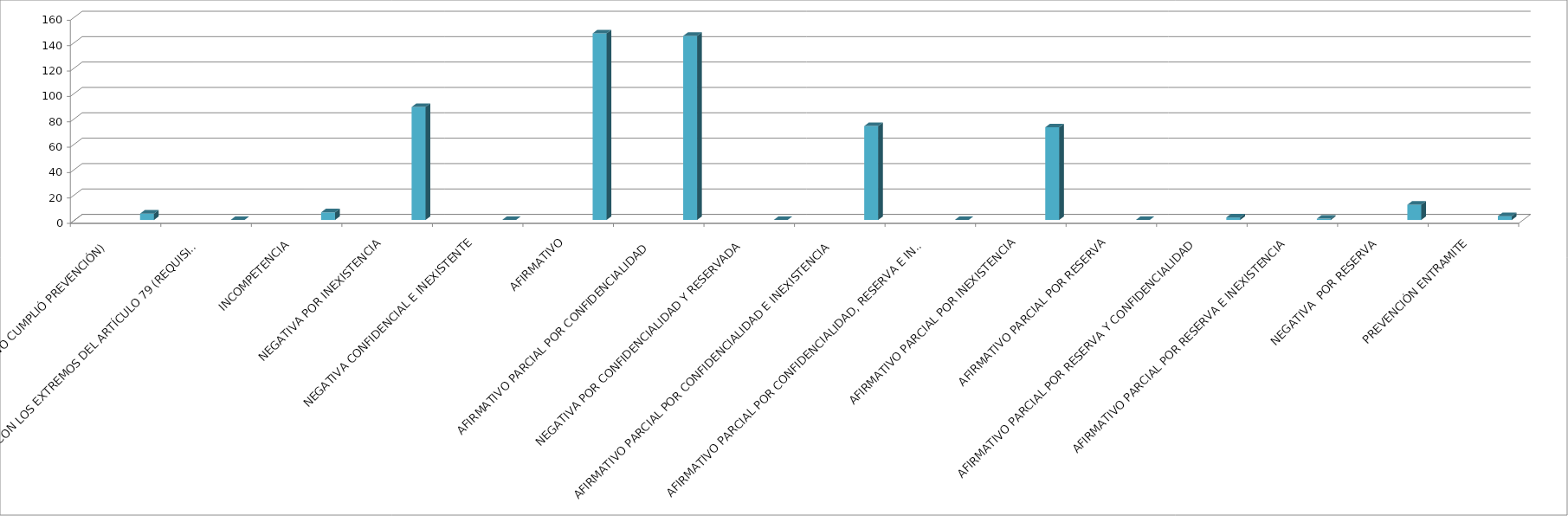
| Category | Series 0 | Series 1 | Series 2 | Series 3 | Series 4 |
|---|---|---|---|---|---|
| SE TIENE POR NO PRESENTADA ( NO CUMPLIÓ PREVENCIÓN) |  |  |  |  | 5 |
| NO CUMPLIO CON LOS EXTREMOS DEL ARTÍCULO 79 (REQUISITOS) |  |  |  |  | 0 |
| INCOMPETENCIA  |  |  |  |  | 6 |
| NEGATIVA POR INEXISTENCIA |  |  |  |  | 89 |
| NEGATIVA CONFIDENCIAL E INEXISTENTE |  |  |  |  | 0 |
| AFIRMATIVO |  |  |  |  | 147 |
| AFIRMATIVO PARCIAL POR CONFIDENCIALIDAD  |  |  |  |  | 145 |
| NEGATIVA POR CONFIDENCIALIDAD Y RESERVADA |  |  |  |  | 0 |
| AFIRMATIVO PARCIAL POR CONFIDENCIALIDAD E INEXISTENCIA |  |  |  |  | 74 |
| AFIRMATIVO PARCIAL POR CONFIDENCIALIDAD, RESERVA E INEXISTENCIA |  |  |  |  | 0 |
| AFIRMATIVO PARCIAL POR INEXISTENCIA |  |  |  |  | 73 |
| AFIRMATIVO PARCIAL POR RESERVA |  |  |  |  | 0 |
| AFIRMATIVO PARCIAL POR RESERVA Y CONFIDENCIALIDAD |  |  |  |  | 2 |
| AFIRMATIVO PARCIAL POR RESERVA E INEXISTENCIA |  |  |  |  | 1 |
| NEGATIVA  POR RESERVA |  |  |  |  | 12 |
| PREVENCIÓN ENTRAMITE |  |  |  |  | 3 |